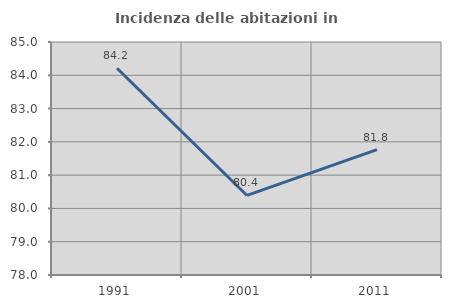
| Category | Incidenza delle abitazioni in proprietà  |
|---|---|
| 1991.0 | 84.211 |
| 2001.0 | 80.39 |
| 2011.0 | 81.768 |